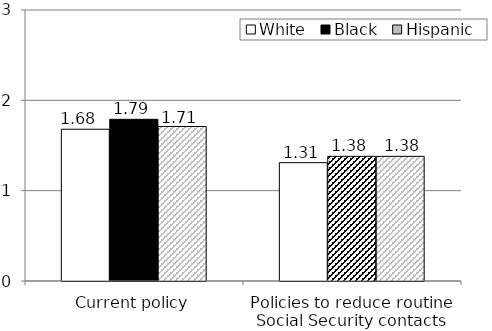
| Category | White | Black | Hispanic |
|---|---|---|---|
| Current policy | 1.68 | 1.79 | 1.71 |
| Policies to reduce routine Social Security contacts | 1.31 | 1.38 | 1.38 |